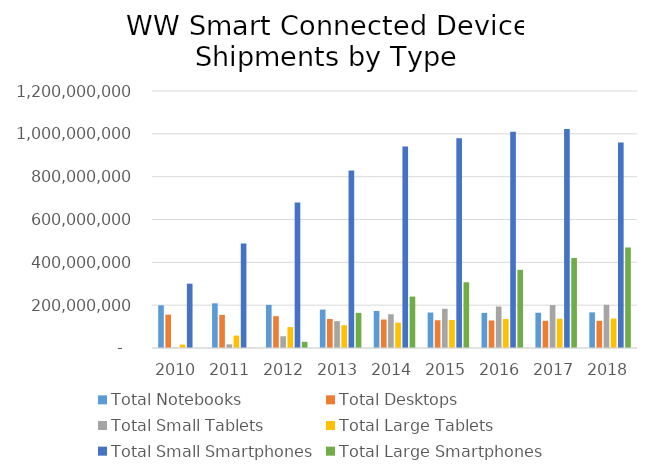
| Category | Total Notebooks | Total Desktops | Total Small Tablets | Total Large Tablets | Total Small Smartphones | Total Large Smartphones |
|---|---|---|---|---|---|---|
| 2010.0 | 199357145 | 155720650 | 2552360 | 15989245 | 300407520 | 256545 |
| 2011.0 | 208658004 | 154597419 | 17025904 | 57936990 | 488128529 | 1204315 |
| 2012.0 | 201398363 | 148537468 | 54720582 | 97646225 | 678952383 | 28767916 |
| 2013.0 | 179412440 | 135443713 | 125718691 | 106408884 | 829294609 | 164141236 |
| 2014.0 | 173047637 | 132985021 | 157558170 | 118154837 | 941316557 | 240149490 |
| 2015.0 | 165585621 | 129587203 | 183109156 | 130768388 | 979038641 | 306787778 |
| 2016.0 | 163953909 | 128456642 | 193971241 | 135096490 | 1009908694 | 364780269 |
| 2017.0 | 164509921 | 126783037 | 200282351 | 136493098 | 1022015513 | 420268557 |
| 2018.0 | 166448343 | 126892066 | 201608838 | 137545214 | 959357687 | 469385790 |